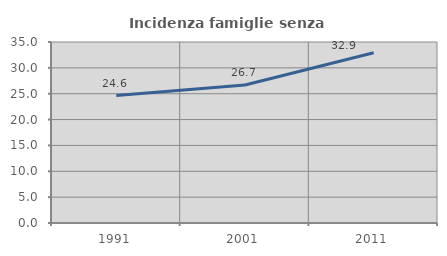
| Category | Incidenza famiglie senza nuclei |
|---|---|
| 1991.0 | 24.635 |
| 2001.0 | 26.691 |
| 2011.0 | 32.92 |